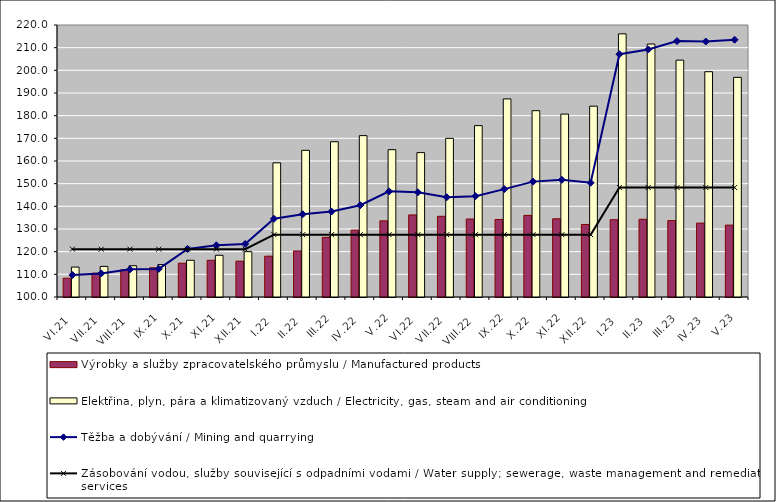
| Category | Výrobky a služby zpracovatelského průmyslu / Manufactured products | Elektřina, plyn, pára a klimatizovaný vzduch / Electricity, gas, steam and air conditioning |
|---|---|---|
| VI.21 | 108.3 | 113.2 |
| VII.21 | 110.5 | 113.5 |
| VIII.21 | 112 | 113.8 |
| IX.21 | 112.9 | 114.3 |
| X.21 | 114.9 | 116.2 |
| XI.21 | 116.2 | 118.4 |
| XII.21 | 115.8 | 120 |
| I.22 | 118 | 159.2 |
| II.22 | 120.3 | 164.7 |
| III.22 | 126.3 | 168.5 |
| IV.22 | 129.5 | 171.2 |
| V.22 | 133.6 | 165 |
| VI.22 | 136.2 | 163.7 |
| VII.22 | 135.6 | 170 |
| VIII.22 | 134.4 | 175.6 |
| IX.22 | 134.2 | 187.4 |
| X.22 | 136 | 182.2 |
| XI.22 | 134.5 | 180.7 |
| XII.22 | 132 | 184.2 |
| I.23 | 134.1 | 216.1 |
| II.23 | 134.3 | 211.6 |
| III.23 | 133.7 | 204.5 |
| IV.23 | 132.6 | 199.4 |
| V.23 | 131.7 | 196.9 |